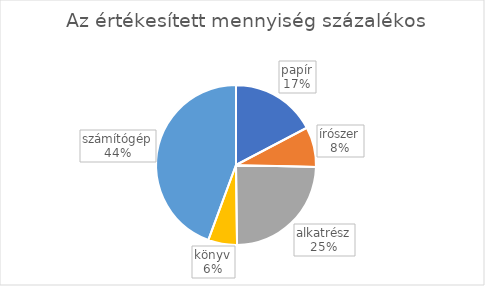
| Category | Series 0 |
|---|---|
| papír | 0.173 |
| írószer | 0.081 |
| alkatrész | 0.244 |
| könyv | 0.058 |
| számítógép | 0.444 |